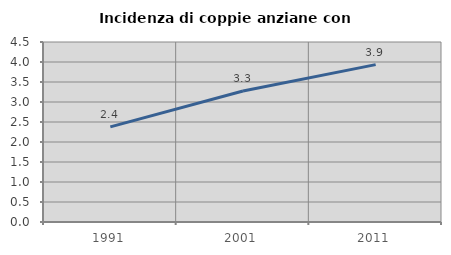
| Category | Incidenza di coppie anziane con figli |
|---|---|
| 1991.0 | 2.377 |
| 2001.0 | 3.275 |
| 2011.0 | 3.934 |